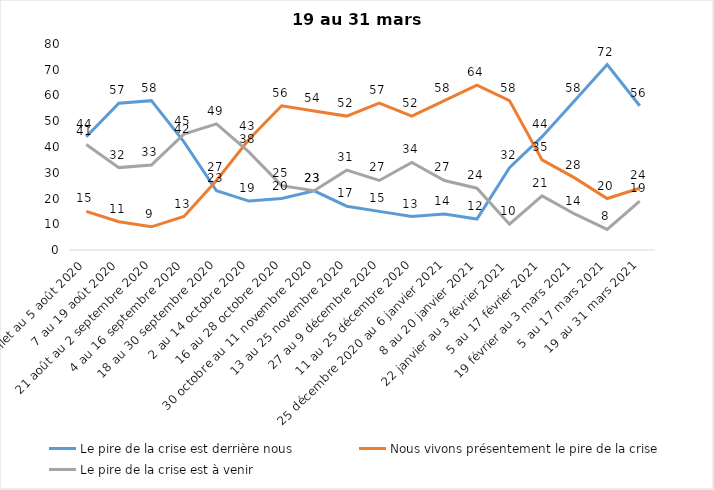
| Category | Le pire de la crise est derrière nous | Nous vivons présentement le pire de la crise | Le pire de la crise est à venir |
|---|---|---|---|
| 24 juillet au 5 août 2020 | 44 | 15 | 41 |
| 7 au 19 août 2020 | 57 | 11 | 32 |
| 21 août au 2 septembre 2020 | 58 | 9 | 33 |
| 4 au 16 septembre 2020 | 42 | 13 | 45 |
| 18 au 30 septembre 2020 | 23 | 27 | 49 |
| 2 au 14 octobre 2020 | 19 | 43 | 38 |
| 16 au 28 octobre 2020 | 20 | 56 | 25 |
| 30 octobre au 11 novembre 2020 | 23 | 54 | 23 |
| 13 au 25 novembre 2020 | 17 | 52 | 31 |
| 27 au 9 décembre 2020 | 15 | 57 | 27 |
| 11 au 25 décembre 2020 | 13 | 52 | 34 |
| 25 décembre 2020 au 6 janvier 2021 | 14 | 58 | 27 |
| 8 au 20 janvier 2021 | 12 | 64 | 24 |
| 22 janvier au 3 février 2021 | 32 | 58 | 10 |
| 5 au 17 février 2021 | 44 | 35 | 21 |
| 19 février au 3 mars 2021 | 58 | 28 | 14 |
| 5 au 17 mars 2021 | 72 | 20 | 8 |
| 19 au 31 mars 2021 | 56 | 24 | 19 |